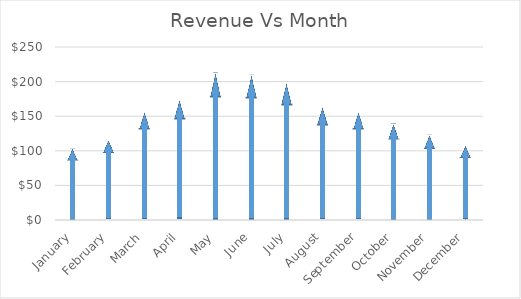
| Category | Series 0 |
|---|---|
| January | 103 |
| February | 115 |
| March | 156 |
| April | 173 |
| May | 213 |
| June | 210 |
| July | 198 |
| August | 163 |
| September | 155.5 |
| October | 139.3 |
| November | 123.1 |
| December | 106.9 |